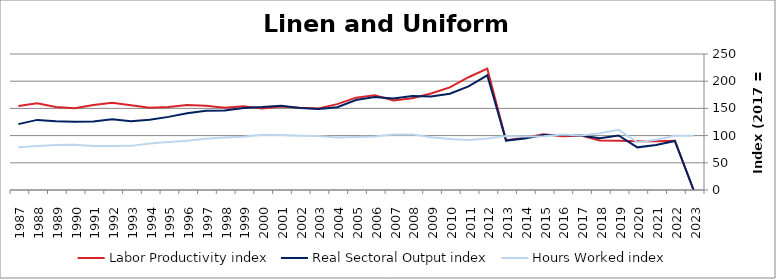
| Category | Labor Productivity index | Real Sectoral Output index | Hours Worked index |
|---|---|---|---|
| 2023.0 | 0 | 0 | 99.605 |
| 2022.0 | 90.505 | 90.092 | 99.544 |
| 2021.0 | 89.464 | 82.647 | 92.381 |
| 2020.0 | 89.439 | 78.373 | 87.627 |
| 2019.0 | 90.645 | 100.32 | 110.674 |
| 2018.0 | 91.205 | 95.142 | 104.317 |
| 2017.0 | 100 | 100 | 100 |
| 2016.0 | 98.999 | 101.138 | 102.161 |
| 2015.0 | 102.267 | 101.229 | 98.986 |
| 2014.0 | 96.283 | 94.563 | 98.214 |
| 2013.0 | 91.432 | 90.844 | 99.357 |
| 2012.0 | 223.09 | 210.848 | 94.513 |
| 2011.0 | 207.321 | 190.372 | 91.825 |
| 2010.0 | 188.734 | 177.072 | 93.821 |
| 2009.0 | 177.284 | 171.702 | 96.851 |
| 2008.0 | 168.816 | 172.599 | 102.241 |
| 2007.0 | 164.631 | 168.144 | 102.134 |
| 2006.0 | 173.933 | 170.877 | 98.243 |
| 2005.0 | 169.745 | 165.456 | 97.473 |
| 2004.0 | 157.817 | 152.24 | 96.466 |
| 2003.0 | 149.901 | 148.841 | 99.293 |
| 2002.0 | 151.129 | 150.924 | 99.864 |
| 2001.0 | 153.481 | 155.037 | 101.014 |
| 2000.0 | 149.994 | 152.506 | 101.674 |
| 1999.0 | 153.955 | 150.886 | 98.007 |
| 1998.0 | 151.392 | 146.056 | 96.475 |
| 1997.0 | 155.045 | 145.743 | 94 |
| 1996.0 | 156.198 | 141.235 | 90.421 |
| 1995.0 | 152.641 | 134.403 | 88.052 |
| 1994.0 | 151.006 | 129.277 | 85.611 |
| 1993.0 | 155.97 | 126.532 | 81.126 |
| 1992.0 | 160.369 | 129.923 | 81.015 |
| 1991.0 | 156.275 | 126.144 | 80.719 |
| 1990.0 | 150.406 | 125.323 | 83.323 |
| 1989.0 | 152.703 | 126.347 | 82.74 |
| 1988.0 | 159.413 | 128.876 | 80.844 |
| 1987.0 | 154.33 | 121.098 | 78.467 |